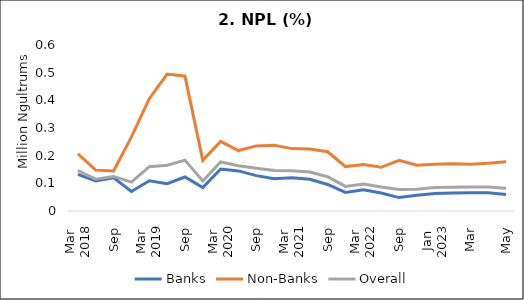
| Category | Banks | Non-Banks | Overall |
|---|---|---|---|
| 0 | 0.133 | 0.207 | 0.146 |
| 1 | 0.108 | 0.148 | 0.115 |
| 2 | 0.12 | 0.144 | 0.124 |
| 3 | 0.07 | 0.268 | 0.104 |
| 4 | 0.109 | 0.406 | 0.16 |
| 5 | 0.099 | 0.495 | 0.165 |
| 6 | 0.123 | 0.487 | 0.184 |
| 7 | 0.084 | 0.183 | 0.109 |
| 8 | 0.152 | 0.251 | 0.177 |
| 9 | 0.145 | 0.218 | 0.164 |
| 10 | 0.128 | 0.235 | 0.154 |
| 11 | 0.117 | 0.237 | 0.146 |
| 12 | 0.121 | 0.226 | 0.146 |
| 13 | 0.115 | 0.224 | 0.141 |
| 14 | 0.096 | 0.214 | 0.124 |
| 15 | 0.067 | 0.16 | 0.089 |
| 16 | 0.077 | 0.168 | 0.098 |
| 17 | 0.065 | 0.158 | 0.086 |
| 18 | 0.048 | 0.183 | 0.078 |
| 19 | 0.057 | 0.165 | 0.079 |
| 20 | 0.063 | 0.169 | 0.085 |
| 21 | 0.065 | 0.171 | 0.086 |
| 22 | 0.066 | 0.169 | 0.087 |
| 23 | 0.066 | 0.173 | 0.087 |
| 24 | 0.06 | 0.178 | 0.082 |